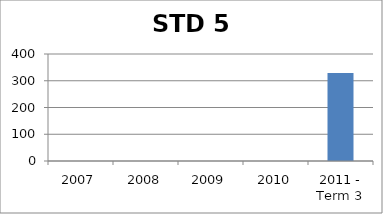
| Category | Score |
|---|---|
| 2007 | 0 |
| 2008 | 0 |
| 2009 | 0 |
| 2010 | 0 |
| 2011 - Term 3 | 329.35 |